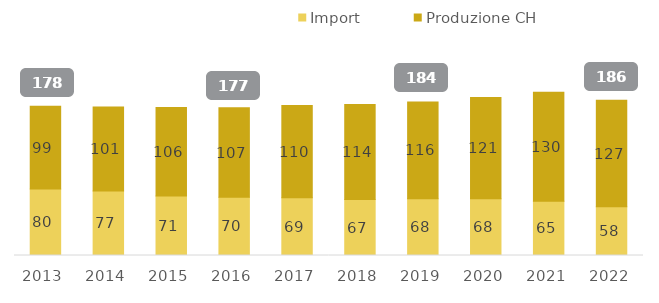
| Category | Import | Produzione CH  |
|---|---|---|
| 2013.0 | 79.509 | 98.927 |
| 2014.0 | 77.035 | 100.738 |
| 2015.0 | 71.121 | 105.94 |
| 2016.0 | 69.556 | 107.038 |
| 2017.0 | 68.988 | 110.478 |
| 2018.0 | 66.846 | 113.866 |
| 2019.0 | 67.949 | 115.781 |
| 2020.0 | 67.916 | 121.016 |
| 2021.0 | 65.007 | 130.157 |
| 2022.0 | 58.281 | 127.355 |